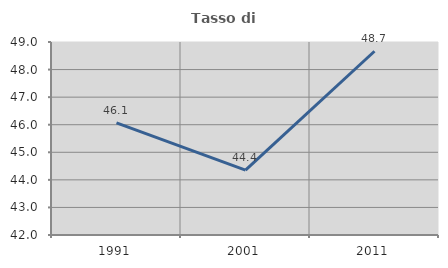
| Category | Tasso di occupazione   |
|---|---|
| 1991.0 | 46.064 |
| 2001.0 | 44.354 |
| 2011.0 | 48.665 |